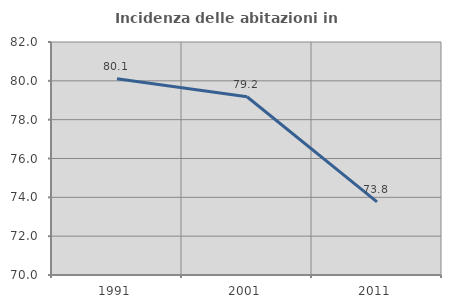
| Category | Incidenza delle abitazioni in proprietà  |
|---|---|
| 1991.0 | 80.112 |
| 2001.0 | 79.179 |
| 2011.0 | 73.762 |